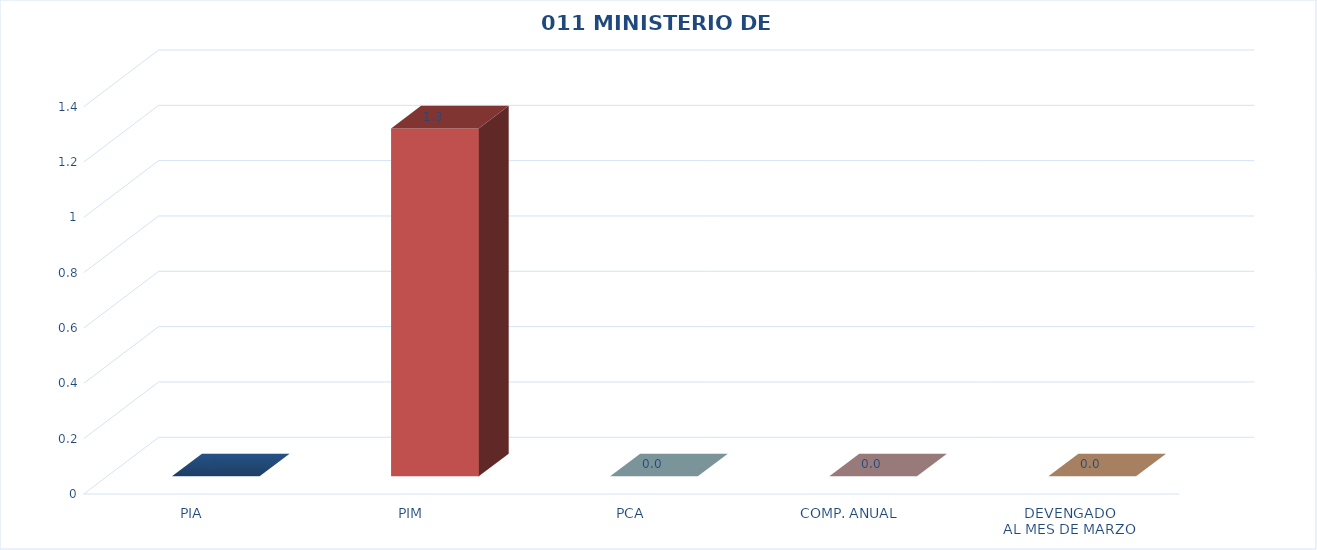
| Category | 011 MINISTERIO DE SALUD |
|---|---|
| PIA | 0 |
| PIM | 1.257 |
| PCA | 0 |
| COMP. ANUAL | 0 |
| DEVENGADO
AL MES DE MARZO | 0 |